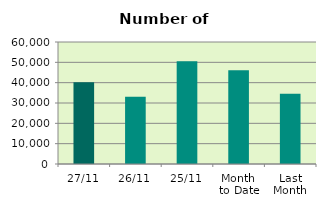
| Category | Series 0 |
|---|---|
| 27/11 | 40248 |
| 26/11 | 33090 |
| 25/11 | 50558 |
| Month 
to Date | 46132.2 |
| Last
Month | 34490.636 |